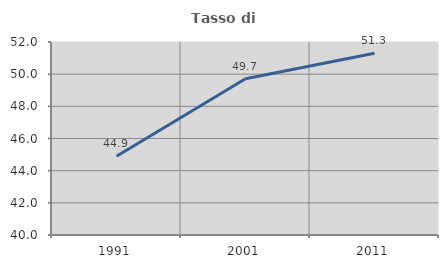
| Category | Tasso di occupazione   |
|---|---|
| 1991.0 | 44.9 |
| 2001.0 | 49.714 |
| 2011.0 | 51.304 |